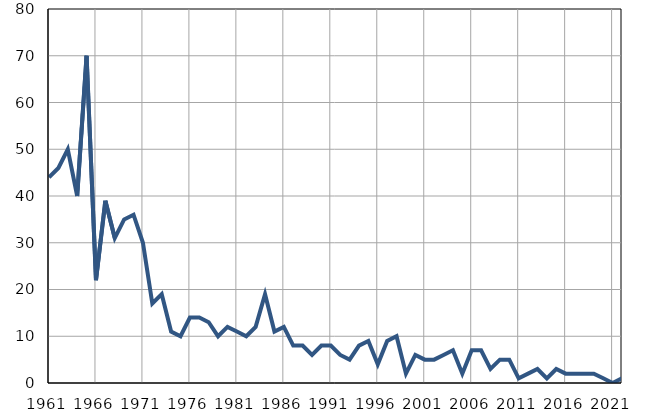
| Category | Умрла 
одојчад |
|---|---|
| 1961.0 | 44 |
| 1962.0 | 46 |
| 1963.0 | 50 |
| 1964.0 | 40 |
| 1965.0 | 70 |
| 1966.0 | 22 |
| 1967.0 | 39 |
| 1968.0 | 31 |
| 1969.0 | 35 |
| 1970.0 | 36 |
| 1971.0 | 30 |
| 1972.0 | 17 |
| 1973.0 | 19 |
| 1974.0 | 11 |
| 1975.0 | 10 |
| 1976.0 | 14 |
| 1977.0 | 14 |
| 1978.0 | 13 |
| 1979.0 | 10 |
| 1980.0 | 12 |
| 1981.0 | 11 |
| 1982.0 | 10 |
| 1983.0 | 12 |
| 1984.0 | 19 |
| 1985.0 | 11 |
| 1986.0 | 12 |
| 1987.0 | 8 |
| 1988.0 | 8 |
| 1989.0 | 6 |
| 1990.0 | 8 |
| 1991.0 | 8 |
| 1992.0 | 6 |
| 1993.0 | 5 |
| 1994.0 | 8 |
| 1995.0 | 9 |
| 1996.0 | 4 |
| 1997.0 | 9 |
| 1998.0 | 10 |
| 1999.0 | 2 |
| 2000.0 | 6 |
| 2001.0 | 5 |
| 2002.0 | 5 |
| 2003.0 | 6 |
| 2004.0 | 7 |
| 2005.0 | 2 |
| 2006.0 | 7 |
| 2007.0 | 7 |
| 2008.0 | 3 |
| 2009.0 | 5 |
| 2010.0 | 5 |
| 2011.0 | 1 |
| 2012.0 | 2 |
| 2013.0 | 3 |
| 2014.0 | 1 |
| 2015.0 | 3 |
| 2016.0 | 2 |
| 2017.0 | 2 |
| 2018.0 | 2 |
| 2019.0 | 2 |
| 2020.0 | 1 |
| 2021.0 | 0 |
| 2022.0 | 1 |